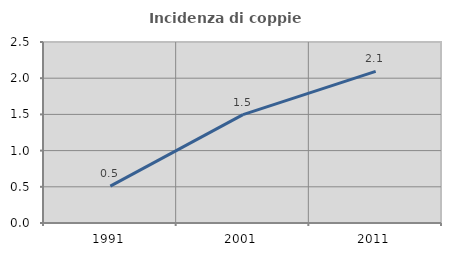
| Category | Incidenza di coppie miste |
|---|---|
| 1991.0 | 0.51 |
| 2001.0 | 1.497 |
| 2011.0 | 2.095 |